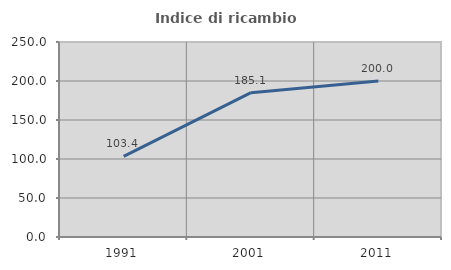
| Category | Indice di ricambio occupazionale  |
|---|---|
| 1991.0 | 103.395 |
| 2001.0 | 185.057 |
| 2011.0 | 200 |